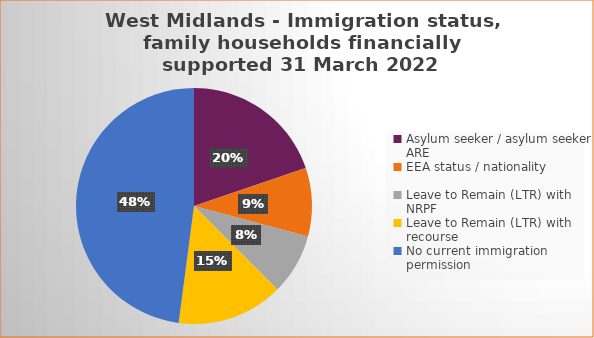
| Category | Number | Percentage |
|---|---|---|
| Asylum seeker / asylum seeker ARE | 19 | 0.198 |
| EEA status / nationality  | 9 | 0.094 |
| Leave to Remain (LTR) with NRPF | 8 | 0.083 |
| Leave to Remain (LTR) with recourse | 14 | 0.146 |
| No current immigration permission | 46 | 0.479 |